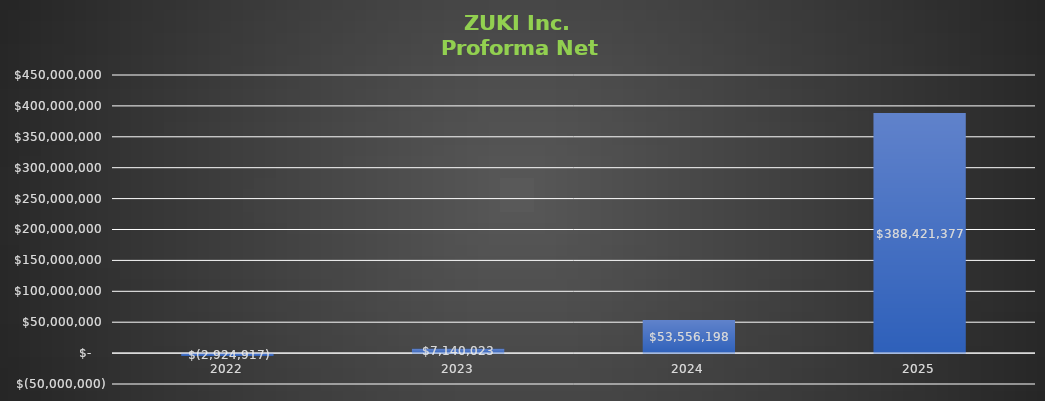
| Category | Series 0 |
|---|---|
| 2022 | -2924916.822 |
| 2023 | 7140023.396 |
| 2024 | 53556198.171 |
| 2025 | 388421377.129 |